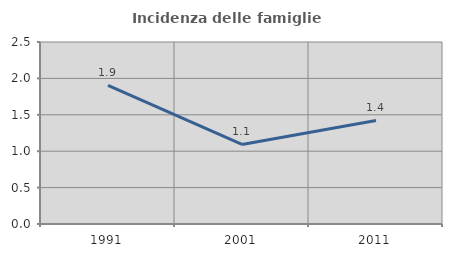
| Category | Incidenza delle famiglie numerose |
|---|---|
| 1991.0 | 1.905 |
| 2001.0 | 1.093 |
| 2011.0 | 1.423 |